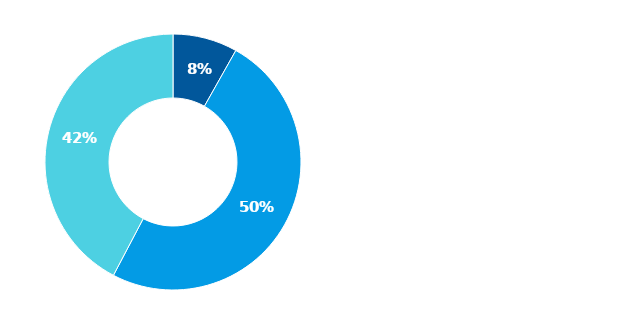
| Category | Series 0 |
|---|---|
| Hotovost | 0.082 |
| Půjčky poskytnuté nemovitostní společnosti | 0.495 |
| Majetkové účasti v nemovitostní společnosti | 0.423 |
| Ostatní finanční aktiva | 0 |